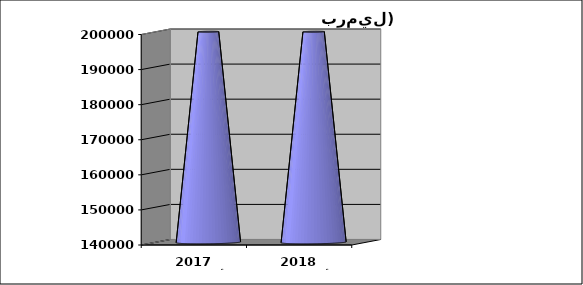
| Category | كمية النفط الخام المنتج (الف برميل) |
|---|---|
| الفصل الأول 2018 | 392409 |
| الفصل الأول 2017 | 381269 |